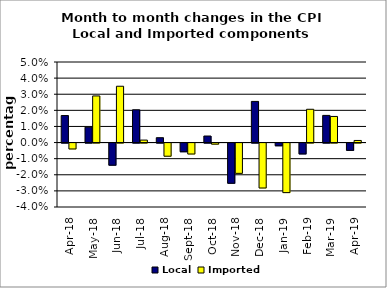
| Category | Local | Imported |
|---|---|---|
| 2018-04-01 | 0.017 | -0.004 |
| 2018-05-01 | 0.01 | 0.029 |
| 2018-06-01 | -0.014 | 0.035 |
| 2018-07-01 | 0.02 | 0.002 |
| 2018-08-01 | 0.003 | -0.008 |
| 2018-09-01 | -0.005 | -0.007 |
| 2018-10-01 | 0.004 | -0.001 |
| 2018-11-01 | -0.025 | -0.019 |
| 2018-12-01 | 0.026 | -0.028 |
| 2019-01-01 | -0.002 | -0.031 |
| 2019-02-01 | -0.007 | 0.021 |
| 2019-03-01 | 0.017 | 0.016 |
| 2019-04-01 | -0.005 | 0.001 |